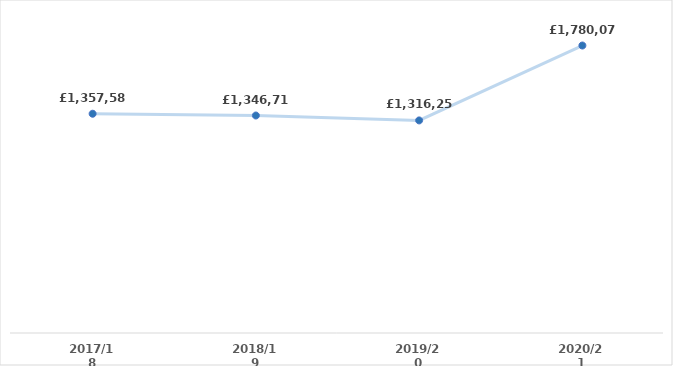
| Category | Series 0 |
|---|---|
| 2017/18 | 1357585.69 |
| 2018/19 | 1346710 |
| 2019/20 | 1316250 |
| 2020/21 | 1780075.34 |